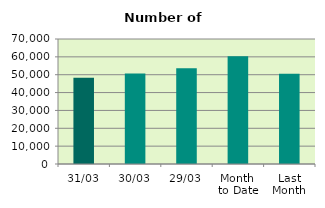
| Category | Series 0 |
|---|---|
| 31/03 | 48304 |
| 30/03 | 50696 |
| 29/03 | 53650 |
| Month 
to Date | 60380.087 |
| Last
Month | 50484.7 |